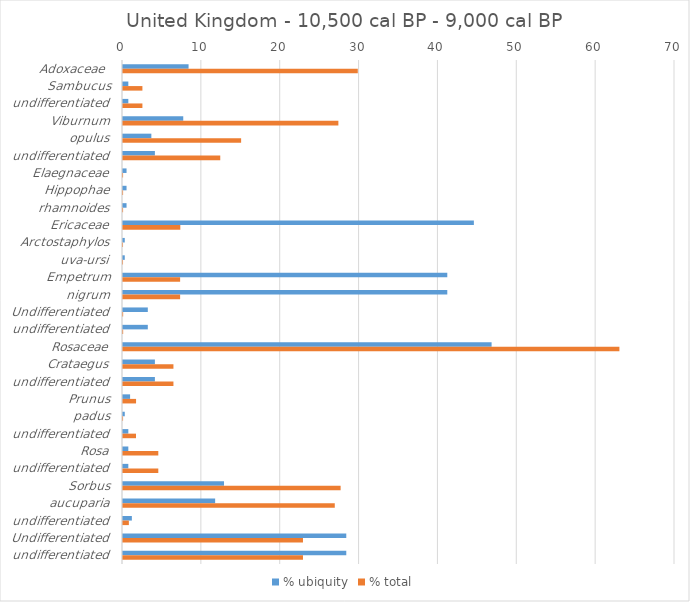
| Category | % ubiquity | % total |
|---|---|---|
| Adoxaceae  | 8.315 | 29.773 |
| Sambucus | 0.674 | 2.461 |
| undifferentiated | 0.674 | 2.461 |
| Viburnum | 7.64 | 27.312 |
| opulus | 3.596 | 14.979 |
| undifferentiated | 4.045 | 12.333 |
| Elaegnaceae | 0.449 | 0.011 |
| Hippophae | 0.449 | 0.011 |
| rhamnoides | 0.449 | 0.011 |
| Ericaceae | 44.494 | 7.267 |
| Arctostaphylos | 0.225 | 0.003 |
| uva-ursi | 0.225 | 0.003 |
| Empetrum | 41.124 | 7.243 |
| nigrum | 41.124 | 7.243 |
| Undifferentiated | 3.146 | 0.02 |
| undifferentiated | 3.146 | 0.02 |
| Rosaceae | 46.742 | 62.949 |
| Crataegus | 4.045 | 6.396 |
| undifferentiated | 4.045 | 6.396 |
| Prunus | 0.899 | 1.656 |
| padus | 0.225 | 0.009 |
| undifferentiated | 0.674 | 1.647 |
| Rosa | 0.674 | 4.476 |
| undifferentiated | 0.674 | 4.476 |
| Sorbus | 12.809 | 27.598 |
| aucuparia | 11.685 | 26.856 |
| undifferentiated | 1.124 | 0.742 |
| Undifferentiated | 28.315 | 22.823 |
| undifferentiated | 28.315 | 22.823 |